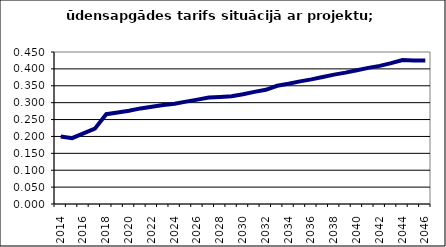
| Category | Series 0 |
|---|---|
| 2014.0 | 0.2 |
| 2015.0 | 0.195 |
| 2016.0 | 0.209 |
| 2017.0 | 0.223 |
| 2018.0 | 0.266 |
| 2019.0 | 0.271 |
| 2020.0 | 0.276 |
| 2021.0 | 0.283 |
| 2022.0 | 0.288 |
| 2023.0 | 0.293 |
| 2024.0 | 0.297 |
| 2025.0 | 0.303 |
| 2026.0 | 0.309 |
| 2027.0 | 0.315 |
| 2028.0 | 0.317 |
| 2029.0 | 0.319 |
| 2030.0 | 0.325 |
| 2031.0 | 0.332 |
| 2032.0 | 0.338 |
| 2033.0 | 0.35 |
| 2034.0 | 0.356 |
| 2035.0 | 0.363 |
| 2036.0 | 0.369 |
| 2037.0 | 0.376 |
| 2038.0 | 0.383 |
| 2039.0 | 0.389 |
| 2040.0 | 0.396 |
| 2041.0 | 0.403 |
| 2042.0 | 0.409 |
| 2043.0 | 0.417 |
| 2044.0 | 0.426 |
| 2045.0 | 0.425 |
| 2046.0 | 0.425 |